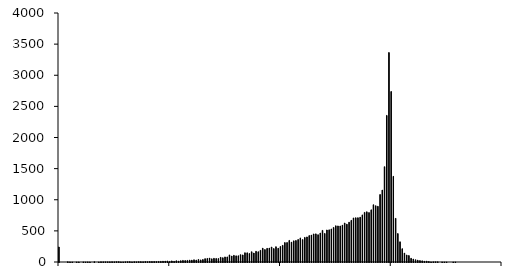
| Category | Series 0 |
|---|---|
| -1.00_-0.99 | 242 |
| -0.99_-0.98 | 0 |
| -0.98_-0.97 | 0 |
| -0.97_-0.96 | 0 |
| -0.96_-0.95 | 4 |
| -0.95_-0.94 | 2 |
| -0.94_-0.93 | 1 |
| -0.93_-0.92 | 0 |
| -0.92_-0.91 | 1 |
| -0.91_-0.90 | 1 |
| -0.90_-0.89 | 0 |
| -0.89_-0.88 | 2 |
| -0.88_-0.87 | 1 |
| -0.87_-0.86 | 2 |
| -0.86_-0.85 | 1 |
| -0.85_-0.84 | 0 |
| -0.84_-0.83 | 5 |
| -0.83_-0.82 | 0 |
| -0.82_-0.81 | 1 |
| -0.81_-0.80 | 4 |
| -0.80_-0.79 | 3 |
| -0.79_-0.78 | 3 |
| -0.78_-0.77 | 3 |
| -0.77_-0.76 | 3 |
| -0.76_-0.75 | 5 |
| -0.75_-0.74 | 3 |
| -0.74_-0.73 | 6 |
| -0.73_-0.72 | 6 |
| -0.72_-0.71 | 2 |
| -0.71_-0.70 | 2 |
| -0.70_-0.69 | 3 |
| -0.69_-0.68 | 5 |
| -0.68_-0.67 | 6 |
| -0.67_-0.66 | 2 |
| -0.66_-0.65 | 5 |
| -0.65_-0.64 | 3 |
| -0.64_-0.63 | 6 |
| -0.63_-0.62 | 6 |
| -0.62_-0.61 | 4 |
| -0.61_-0.60 | 7 |
| -0.60_-0.59 | 6 |
| -0.59_-0.58 | 8 |
| -0.58_-0.57 | 7 |
| -0.57_-0.56 | 8 |
| -0.56_-0.55 | 7 |
| -0.55_-0.54 | 9 |
| -0.54_-0.53 | 10 |
| -0.53_-0.52 | 13 |
| -0.52_-0.51 | 14 |
| -0.51_-0.50 | 17 |
| -0.50_-0.49 | 10 |
| -0.49_-0.48 | 18 |
| -0.48_-0.47 | 11 |
| -0.47_-0.46 | 20 |
| -0.46_-0.45 | 16 |
| -0.45_-0.44 | 21 |
| -0.44_-0.43 | 26 |
| -0.43_-0.42 | 24 |
| -0.42_-0.41 | 26 |
| -0.41_-0.40 | 31 |
| -0.40_-0.39 | 30 |
| -0.39_-0.38 | 36 |
| -0.38_-0.37 | 32 |
| -0.37_-0.36 | 41 |
| -0.36_-0.35 | 34 |
| -0.35_-0.34 | 40 |
| -0.34_-0.33 | 54 |
| -0.33_-0.32 | 57 |
| -0.32_-0.31 | 64 |
| -0.31_-0.30 | 51 |
| -0.30_-0.29 | 59 |
| -0.29_-0.28 | 57 |
| -0.28_-0.27 | 55 |
| -0.27_-0.26 | 75 |
| -0.26_-0.25 | 69 |
| -0.25_-0.24 | 82 |
| -0.24_-0.23 | 82 |
| -0.23_-0.22 | 114 |
| -0.22_-0.21 | 96 |
| -0.21_-0.20 | 107 |
| -0.20_-0.19 | 99 |
| -0.19_-0.18 | 100 |
| -0.18_-0.17 | 118 |
| -0.17_-0.16 | 114 |
| -0.16_-0.15 | 149 |
| -0.15_-0.14 | 148 |
| -0.14_-0.13 | 137 |
| -0.13_-0.12 | 165 |
| -0.12_-0.11 | 144 |
| -0.11_-0.10 | 172 |
| -0.10_-0.09 | 165 |
| -0.09_-0.08 | 187 |
| -0.08_-0.07 | 222 |
| -0.07_-0.06 | 200 |
| -0.06_-0.05 | 219 |
| -0.05_-0.04 | 224 |
| -0.04_-0.03 | 241 |
| -0.03_-0.02 | 216 |
| -0.02_-0.01 | 246 |
| -0.01_0.00 | 221 |
| 0.00_0.01 | 249 |
| 0.01_0.02 | 268 |
| 0.02_0.03 | 312 |
| 0.03_0.04 | 313 |
| 0.04_0.05 | 347 |
| 0.05_0.06 | 319 |
| 0.06_0.07 | 340 |
| 0.07_0.08 | 346 |
| 0.08_0.09 | 361 |
| 0.09_0.10 | 387 |
| 0.10_0.11 | 360 |
| 0.11_0.12 | 395 |
| 0.12_0.13 | 403 |
| 0.13_0.14 | 424 |
| 0.14_0.15 | 433 |
| 0.15_0.16 | 451 |
| 0.16_0.17 | 452 |
| 0.17_0.18 | 439 |
| 0.18_0.19 | 466 |
| 0.19_0.20 | 508 |
| 0.20_0.21 | 459 |
| 0.21_0.22 | 515 |
| 0.22_0.23 | 517 |
| 0.23_0.24 | 531 |
| 0.24_0.25 | 555 |
| 0.25_0.26 | 582 |
| 0.26_0.27 | 580 |
| 0.27_0.28 | 579 |
| 0.28_0.29 | 592 |
| 0.29_0.30 | 627 |
| 0.30_0.31 | 608 |
| 0.31_0.32 | 640 |
| 0.32_0.33 | 669 |
| 0.33_0.34 | 708 |
| 0.34_0.35 | 711 |
| 0.35_0.36 | 712 |
| 0.36_0.37 | 720 |
| 0.37_0.38 | 757 |
| 0.38_0.39 | 797 |
| 0.39_0.40 | 807 |
| 0.40_0.41 | 794 |
| 0.41_0.42 | 838 |
| 0.42_0.43 | 920 |
| 0.43_0.44 | 904 |
| 0.44_0.45 | 895 |
| 0.45_0.46 | 1084 |
| 0.46_0.47 | 1156 |
| 0.47_0.48 | 1531 |
| 0.48_0.49 | 2355 |
| 0.49_0.50 | 3365 |
| 0.50_0.51 | 2739 |
| 0.51_0.52 | 1376 |
| 0.52_0.53 | 701 |
| 0.53_0.54 | 457 |
| 0.54_0.55 | 325 |
| 0.55_0.56 | 214 |
| 0.56_0.57 | 144 |
| 0.57_0.58 | 113 |
| 0.58_0.59 | 104 |
| 0.59_0.60 | 60 |
| 0.60_0.61 | 48 |
| 0.61_0.62 | 37 |
| 0.62_0.63 | 30 |
| 0.63_0.64 | 23 |
| 0.64_0.65 | 19 |
| 0.65_0.66 | 13 |
| 0.66_0.67 | 15 |
| 0.67_0.68 | 8 |
| 0.68_0.69 | 2 |
| 0.69_0.70 | 3 |
| 0.70_0.71 | 4 |
| 0.71_0.72 | 4 |
| 0.72_0.73 | 0 |
| 0.73_0.74 | 2 |
| 0.74_0.75 | 1 |
| 0.75_0.76 | 1 |
| 0.76_0.77 | 0 |
| 0.77_0.78 | 0 |
| 0.78_0.79 | 1 |
| 0.79_0.80 | 1 |
| 0.80_0.81 | 0 |
| 0.81_0.82 | 0 |
| 0.82_0.83 | 0 |
| 0.83_0.84 | 0 |
| 0.84_0.85 | 0 |
| 0.85_0.86 | 0 |
| 0.86_0.87 | 0 |
| 0.87_0.88 | 0 |
| 0.88_0.89 | 0 |
| 0.89_0.90 | 0 |
| 0.90_0.91 | 0 |
| 0.91_0.92 | 0 |
| 0.92_0.93 | 0 |
| 0.93_0.94 | 0 |
| 0.94_0.95 | 0 |
| 0.95_0.96 | 0 |
| 0.96_0.97 | 0 |
| 0.97_0.98 | 0 |
| 0.98_0.99 | 0 |
| 0.99_1.00 | 0 |